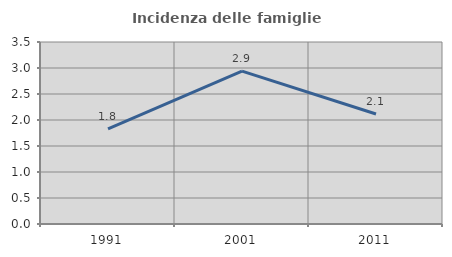
| Category | Incidenza delle famiglie numerose |
|---|---|
| 1991.0 | 1.829 |
| 2001.0 | 2.941 |
| 2011.0 | 2.116 |